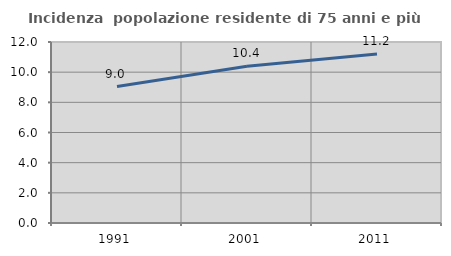
| Category | Incidenza  popolazione residente di 75 anni e più |
|---|---|
| 1991.0 | 9.047 |
| 2001.0 | 10.388 |
| 2011.0 | 11.2 |